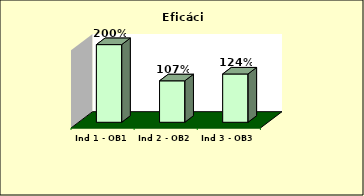
| Category | Series 0 |
|---|---|
| Ind 1 - OB1 | 2 |
| Ind 2 - OB2 | 1.068 |
| Ind 3 - OB3 | 1.244 |